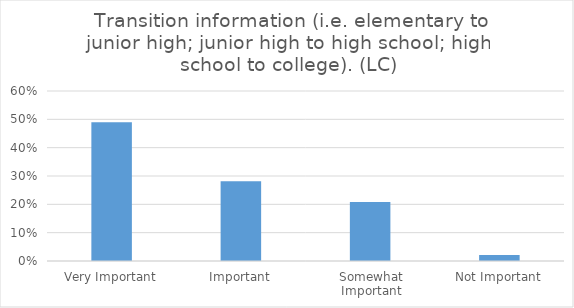
| Category | Transition information (i.e. elementary to junior high; junior high to high school; high school to college). (LC) |
|---|---|
| Very Important | 0.49 |
| Important | 0.281 |
| Somewhat Important | 0.208 |
| Not Important | 0.021 |